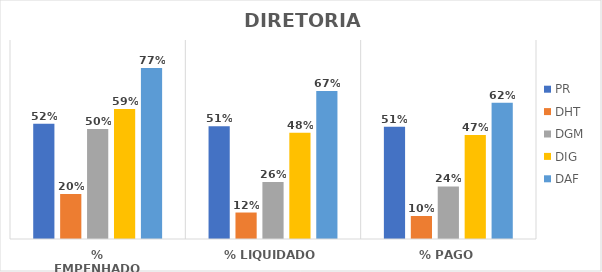
| Category | PR | DHT | DGM | DIG | DAF |
|---|---|---|---|---|---|
| % EMPENHADO | 0.521 | 0.204 | 0.498 | 0.588 | 0.774 |
| % LIQUIDADO | 0.51 | 0.12 | 0.258 | 0.48 | 0.669 |
| % PAGO | 0.508 | 0.104 | 0.238 | 0.471 | 0.616 |